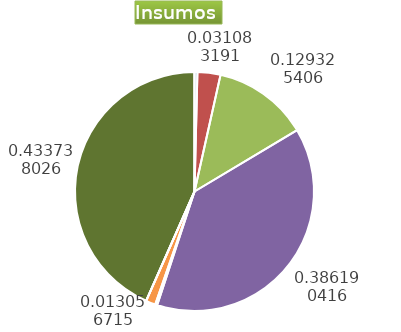
| Category | Series 0 |
|---|---|
| Control arvenses | 221316 |
| Control fitosanitario | 1770226 |
| Cosecha y beneficio | 7365241.189 |
| Fertilización | 21994020 |
| Instalación | 154917.934 |
| Otros | 743596 |
| Podas | 0 |
| Riego | 0 |
| Transporte | 24701915 |
| Tutorado | 0 |